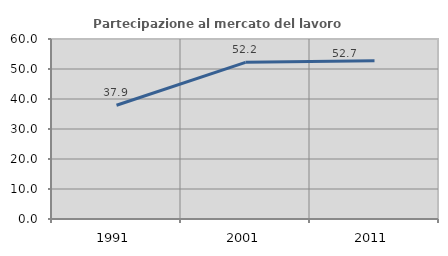
| Category | Partecipazione al mercato del lavoro  femminile |
|---|---|
| 1991.0 | 37.925 |
| 2001.0 | 52.222 |
| 2011.0 | 52.742 |